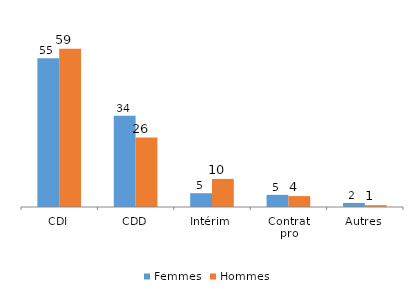
| Category | Femmes | Hommes |
|---|---|---|
| CDI | 55.35 | 58.94 |
| CDD | 34 | 25.87 |
| Intérim | 5.13 | 10.45 |
| Contrat
pro | 4.52 | 4.06 |
| Autres | 1.51 | 0.67 |